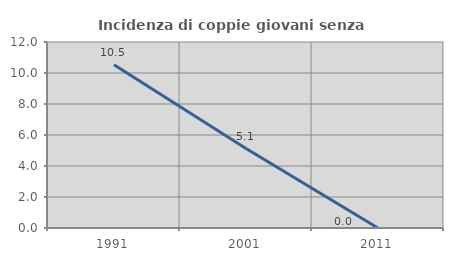
| Category | Incidenza di coppie giovani senza figli |
|---|---|
| 1991.0 | 10.526 |
| 2001.0 | 5.128 |
| 2011.0 | 0 |